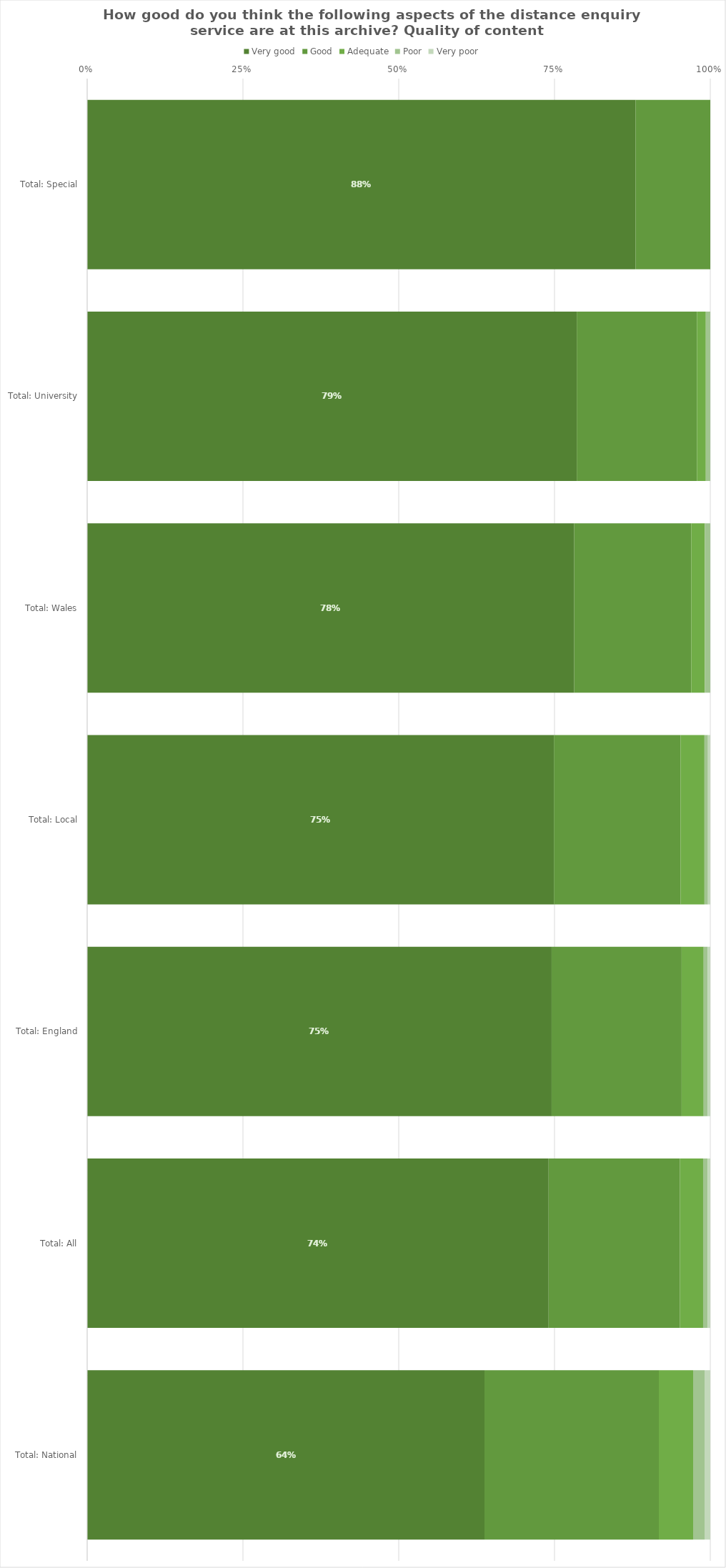
| Category | Very good | Good | Adequate | Poor | Very poor |
|---|---|---|---|---|---|
| Total: Special | 0.88 | 0.12 | 0 | 0 | 0 |
| Total: University | 0.786 | 0.193 | 0.014 | 0.007 | 0 |
| Total: Wales | 0.782 | 0.188 | 0.022 | 0.009 | 0 |
| Total: Local | 0.749 | 0.203 | 0.038 | 0.006 | 0.004 |
| Total: England | 0.745 | 0.209 | 0.035 | 0.006 | 0.004 |
| Total: All | 0.741 | 0.211 | 0.037 | 0.007 | 0.004 |
| Total: National | 0.638 | 0.28 | 0.055 | 0.018 | 0.009 |